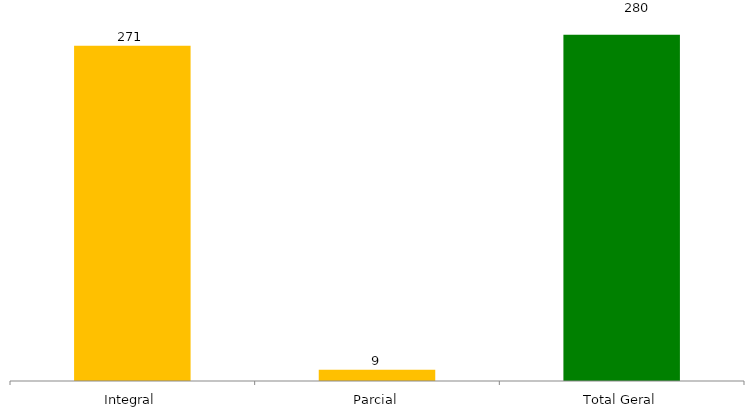
| Category | Categoria/Ano |
|---|---|
| Integral | 271 |
| Parcial | 9 |
| Total Geral | 280 |